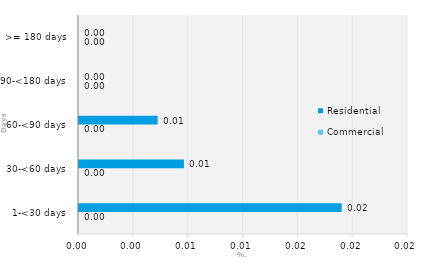
| Category | Commercial | Residential |
|---|---|---|
| 1-<30 days | 0 | 0.019 |
| 30-<60 days | 0 | 0.008 |
| 60-<90 days | 0 | 0.006 |
| 90-<180 days | 0 | 0 |
| >= 180 days | 0 | 0 |